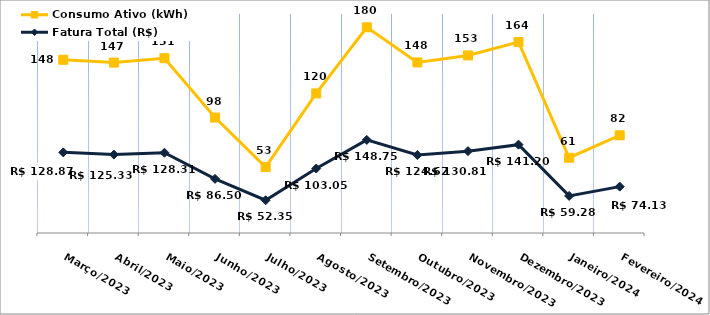
| Category | Fatura Total (R$) | Consumo Ativo (kWh) |
|---|---|---|
| Março/2023 | 128.87 | 148 |
| Abril/2023 | 125.33 | 147 |
| Maio/2023 | 128.31 | 151 |
| Junho/2023 | 86.5 | 98 |
| Julho/2023 | 52.35 | 53 |
| Agosto/2023 | 103.05 | 120 |
| Setembro/2023 | 148.75 | 180 |
| Outubro/2023 | 124.62 | 148 |
| Novembro/2023 | 130.81 | 153 |
| Dezembro/2023 | 141.2 | 164 |
| Janeiro/2024 | 59.28 | 61 |
| Fevereiro/2024 | 74.13 | 82 |